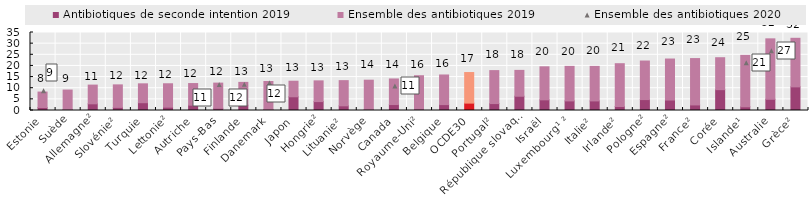
| Category | Antibiotiques de seconde intention 2019 | Ensemble des antibiotiques 2019 |
|---|---|---|
| Estonie | 1.333 | 6.937 |
| Suède | 0.402 | 8.768 |
| Allemagne² | 3 | 8.4 |
| Slovénie² | 1.4 | 10.1 |
| Turquie | 3.501 | 8.471 |
| Lettonie² | 1.5 | 10.5 |
| Autriche | 2.38 | 9.714 |
| Pays-Bas | 1.004 | 11.287 |
| Finlande | 2.407 | 10.213 |
| Danemark | 0.385 | 12.634 |
| Japon | 6.16 | 6.98 |
| Hongrie² | 4 | 9.3 |
| Lituanie² | 2.1 | 11.3 |
| Norvège | 0.4 | 13.2 |
| Canada | 2.667 | 11.487 |
| Royaume-Uni² | 0.6 | 15 |
| Belgique | 2.645 | 13.292 |
| OCDE30 | 3.311 | 13.728 |
| Portugal² | 3.1 | 14.8 |
| République slovaque | 6.4 | 11.6 |
| Israël | 4.788 | 14.822 |
| Luxembourg¹ ² | 4.3 | 15.5 |
| Italie² | 4.3 | 15.5 |
| Irlande² | 1.8 | 19.2 |
| Pologne² | 4.9 | 17.3 |
| Espagne² | 4.7 | 18.4 |
| France² | 2.5 | 20.8 |
| Corée | 9.351 | 14.334 |
| Islande¹ | 1.667 | 23.083 |
| Australie | 5.04 | 27.115 |
| Grèce² | 10.6 | 21.8 |